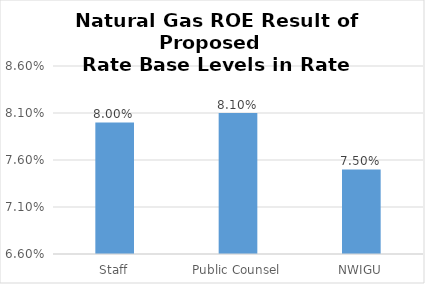
| Category | Natural Gas |
|---|---|
| Staff | 0.08 |
| Public Counsel | 0.081 |
| NWIGU | 0.075 |